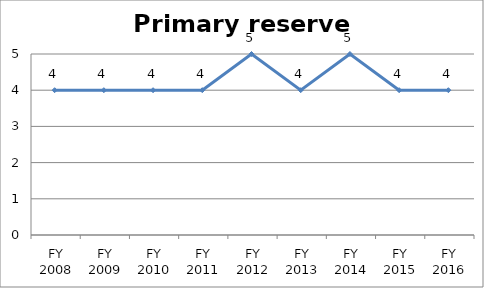
| Category | Primary reserve score |
|---|---|
| FY 2016 | 4 |
| FY 2015 | 4 |
| FY 2014 | 5 |
| FY 2013 | 4 |
| FY 2012 | 5 |
| FY 2011 | 4 |
| FY 2010 | 4 |
| FY 2009 | 4 |
| FY 2008 | 4 |